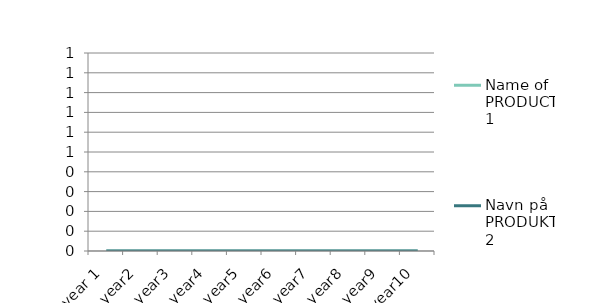
| Category | Name of PRODUCT 1 | Navn på PRODUKT 2 | Navn på PRODUKT 3 | Navn på PRODUKT 4 | Navn på PRODUKT 5 | Navn på PRODUKT 6 | Navn på PRODUKT 7 | Navn på PRODUKT 8 |
|---|---|---|---|---|---|---|---|---|
| year 1 | 0 | 0 |  |  |  |  |  |  |
| year2 | 0 | 0 |  |  |  |  |  |  |
| year3 | 0 | 0 |  |  |  |  |  |  |
| year4 | 0 | 0 |  |  |  |  |  |  |
| year5 | 0 | 0 |  |  |  |  |  |  |
| year6 | 0 | 0 |  |  |  |  |  |  |
| year7 | 0 | 0 |  |  |  |  |  |  |
| year8 | 0 | 0 |  |  |  |  |  |  |
| year9 | 0 | 0 |  |  |  |  |  |  |
| year10 | 0 | 0 |  |  |  |  |  |  |